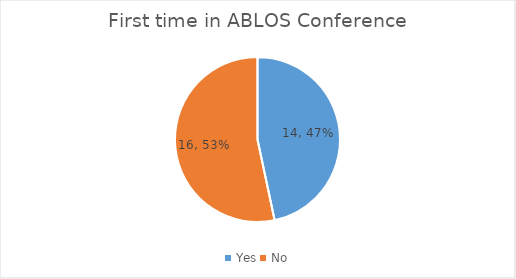
| Category | Series 0 |
|---|---|
| Yes | 14 |
| No | 16 |